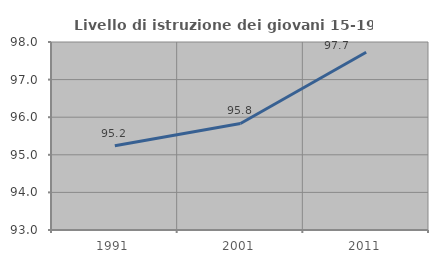
| Category | Livello di istruzione dei giovani 15-19 anni |
|---|---|
| 1991.0 | 95.238 |
| 2001.0 | 95.833 |
| 2011.0 | 97.727 |